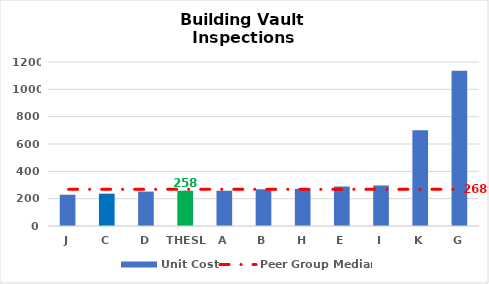
| Category | Unit Cost |
|---|---|
| J | 229 |
| C | 236.43 |
| D | 251.766 |
| THESL | 258 |
| A | 258.156 |
| B | 268.38 |
| H | 272.214 |
| E | 288.828 |
| I | 296.496 |
| K | 700 |
| G | 1136 |